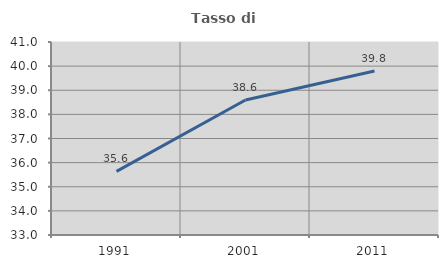
| Category | Tasso di occupazione   |
|---|---|
| 1991.0 | 35.636 |
| 2001.0 | 38.598 |
| 2011.0 | 39.799 |